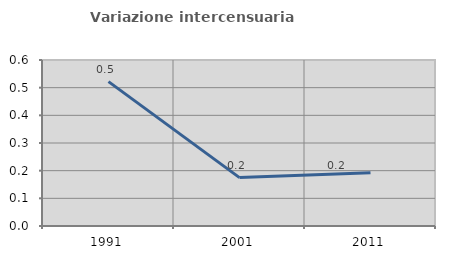
| Category | Variazione intercensuaria annua |
|---|---|
| 1991.0 | 0.522 |
| 2001.0 | 0.175 |
| 2011.0 | 0.193 |